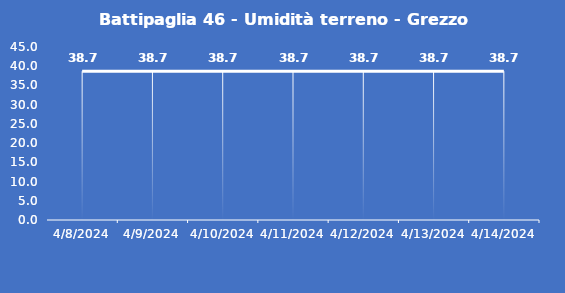
| Category | Battipaglia 46 - Umidità terreno - Grezzo (%VWC) |
|---|---|
| 4/8/24 | 38.7 |
| 4/9/24 | 38.7 |
| 4/10/24 | 38.7 |
| 4/11/24 | 38.7 |
| 4/12/24 | 38.7 |
| 4/13/24 | 38.7 |
| 4/14/24 | 38.7 |